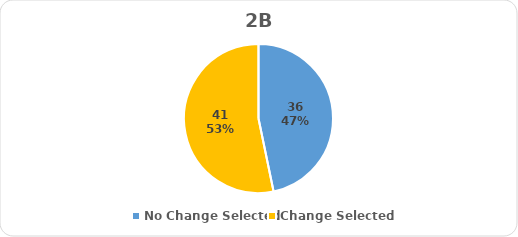
| Category | Series 0 |
|---|---|
| No Change Selected | 36 |
| Change Selected | 41 |